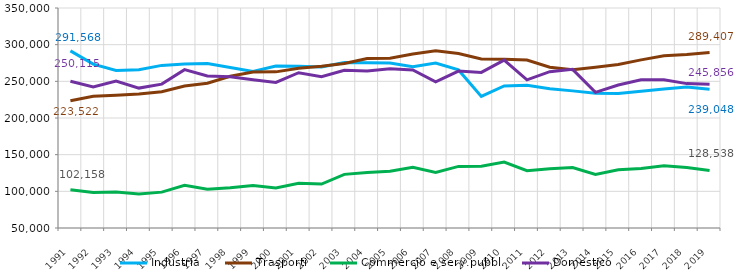
| Category | Industria | Trasporti | Commercio e serv.pubbl. | Domestico |
|---|---|---|---|---|
| 1991 | 291568.134 | 223522.177 | 102158.314 | 250114.541 |
| 1992 | 273408.862 | 229501.653 | 98493.193 | 242262.518 |
| 1993 | 264757.009 | 231173.197 | 99044.843 | 250319.228 |
| 1994 | 265823.936 | 232874.5 | 96202.394 | 240790.882 |
| 1995 | 271746.33 | 235860.204 | 98901.377 | 246191.73 |
| 1996 | 273670.267 | 243539.305 | 108227.072 | 265983.167 |
| 1997 | 274229.826 | 247394.113 | 102888.539 | 257295.969 |
| 1998 | 268897.483 | 256953.2 | 104932.724 | 256285.328 |
| 1999 | 263389.851 | 262712.178 | 107807.964 | 252088.721 |
| 2000 | 270963.625 | 262917.299 | 104721.487 | 248525.256 |
| 2001 | 270533.037 | 267761.389 | 111148.979 | 261792.938 |
| 2002 | 269445.017 | 270588.568 | 109980.934 | 256301.098 |
| 2003 | 275725.293 | 274372.871 | 123139.106 | 265177.963 |
| 2004 | 275386.467 | 281125.353 | 125801.858 | 264142.382 |
| 2005 | 274887.405 | 281579.615 | 127383.117 | 267096.457 |
| 2006 | 269892.563 | 287182.133 | 132704.623 | 265601.376 |
| 2007 | 274839.136 | 291826.558 | 125799.012 | 249421.25 |
| 2008 | 265548.754 | 287854.645 | 134025.757 | 264057.143 |
| 2009 | 229482.176 | 280598.741 | 134113.708 | 262211.737 |
| 2010 | 243717.425 | 279986.454 | 139835.058 | 278890.936 |
| 2011 | 244552.771 | 279057.83 | 128089.733 | 252034.758 |
| 2012 | 239925.947 | 269277.969 | 130901.91 | 263188.033 |
| 2013 | 236980.802 | 265761.719 | 132389.633 | 266311.872 |
| 2014 | 233654.701 | 269243.768 | 123159.093 | 234893.426 |
| 2015 | 233343.439 | 272907.387 | 129361.009 | 245033.471 |
| 2016 | 236350.402 | 279232.923 | 131271.586 | 251999.871 |
| 2017 | 239531.518 | 284949.517 | 134851.091 | 252016.895 |
| 2018 | 242390.939 | 286569.684 | 132477.518 | 246897.188 |
| 2019 | 239047.827 | 289406.868 | 128538.01 | 245855.834 |